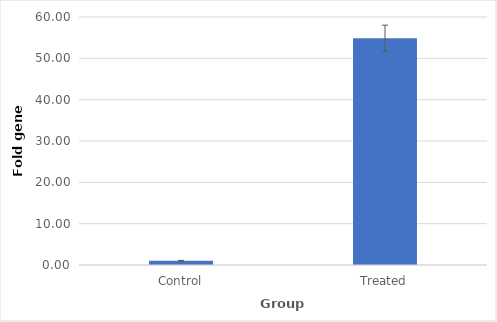
| Category | Series 0 |
|---|---|
| Control | 1.004 |
| Treated | 54.88 |